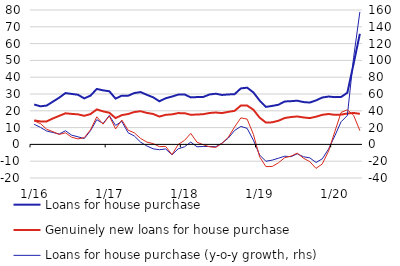
| Category | Loans for house purchase | Genuinely new loans for house purchase |
|---|---|---|
|  1/16 | 23.745 | 14.299 |
| 2 | 22.673 | 13.677 |
| 3 | 23.115 | 13.704 |
| 4 | 25.469 | 15.456 |
| 5 | 27.807 | 16.98 |
| 6 | 30.54 | 18.499 |
| 7 | 30.042 | 18.154 |
| 8 | 29.555 | 17.875 |
| 9 | 27.388 | 17.023 |
| 10 | 29.036 | 18.044 |
| 11 | 33.011 | 20.829 |
| 12 | 32.18 | 19.666 |
|  1/17 | 31.63 | 18.86 |
| 2 | 27.255 | 15.667 |
| 3 | 29.015 | 17.424 |
| 4 | 28.955 | 18.083 |
| 5 | 30.579 | 19.281 |
| 6 | 31.145 | 19.759 |
| 7 | 29.509 | 18.729 |
| 8 | 28.03 | 18.109 |
| 9 | 25.655 | 16.561 |
| 10 | 27.462 | 17.612 |
| 11 | 28.474 | 17.888 |
| 12 | 29.638 | 18.625 |
|  1/18 | 29.767 | 18.587 |
| 2 | 27.982 | 17.634 |
| 3 | 28.173 | 17.779 |
| 4 | 28.224 | 17.993 |
| 5 | 29.726 | 18.68 |
| 6 | 30.168 | 18.974 |
| 7 | 29.437 | 18.624 |
| 8 | 29.74 | 19.378 |
| 9 | 29.882 | 19.973 |
| 10 | 33.339 | 23.116 |
| 11 | 33.777 | 23.15 |
| 12 | 30.953 | 20.646 |
|  1/19 | 26.1 | 15.915 |
| 2 | 22.327 | 12.995 |
| 3 | 22.899 | 13.133 |
| 4 | 23.601 | 14.069 |
| 5 | 25.548 | 15.695 |
| 6 | 25.733 | 16.297 |
| 7 | 26.022 | 16.623 |
| 8 | 25.198 | 16.052 |
| 9 | 24.905 | 15.653 |
| 10 | 26.179 | 16.483 |
| 11 | 27.909 | 17.605 |
| 12 | 28.486 | 18.093 |
|  1/20 | 28.135 | 17.61 |
| 2 | 28.193 | 17.742 |
| 3 | 30.749 | 18.38 |
| 4 | 48.01 | 18.716 |
| 5 | 65.843 | 18.19 |